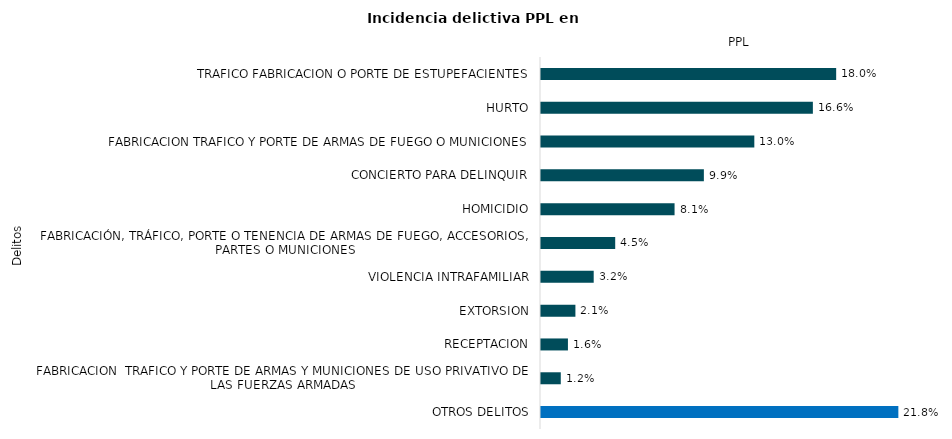
| Category | Series 0 |
|---|---|
| TRAFICO FABRICACION O PORTE DE ESTUPEFACIENTES | 14685 |
| HURTO | 13526 |
| FABRICACION TRAFICO Y PORTE DE ARMAS DE FUEGO O MUNICIONES | 10613 |
| CONCIERTO PARA DELINQUIR | 8103 |
| HOMICIDIO | 6645 |
| FABRICACIÓN, TRÁFICO, PORTE O TENENCIA DE ARMAS DE FUEGO, ACCESORIOS, PARTES O MUNICIONES | 3692 |
| VIOLENCIA INTRAFAMILIAR | 2622 |
| EXTORSION | 1712 |
| RECEPTACION | 1340 |
| FABRICACION  TRAFICO Y PORTE DE ARMAS Y MUNICIONES DE USO PRIVATIVO DE LAS FUERZAS ARMADAS | 984 |
| OTROS DELITOS | 17779 |